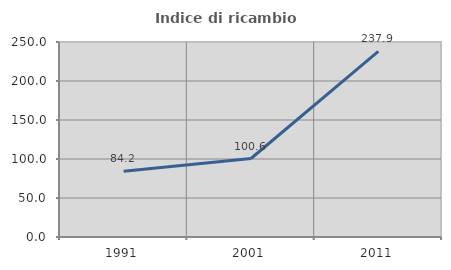
| Category | Indice di ricambio occupazionale  |
|---|---|
| 1991.0 | 84.184 |
| 2001.0 | 100.613 |
| 2011.0 | 237.903 |